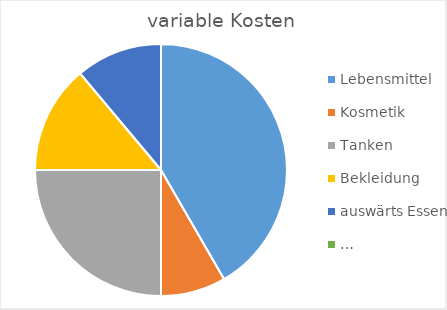
| Category | variable Kosten |
|---|---|
| Lebensmittel | 150 |
| Kosmetik | 30 |
| Tanken | 90 |
| Bekleidung | 50 |
| auswärts Essen | 40 |
| … | 0 |